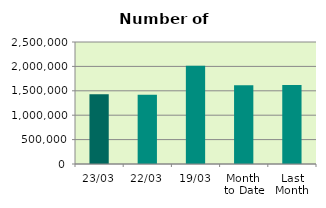
| Category | Series 0 |
|---|---|
| 23/03 | 1426872 |
| 22/03 | 1420564 |
| 19/03 | 2015668 |
| Month 
to Date | 1614374.706 |
| Last
Month | 1618522.4 |